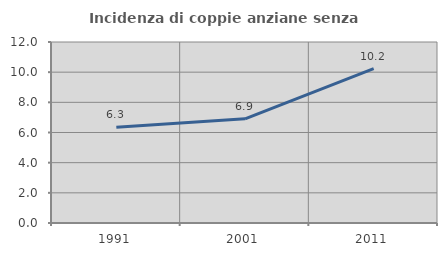
| Category | Incidenza di coppie anziane senza figli  |
|---|---|
| 1991.0 | 6.342 |
| 2001.0 | 6.909 |
| 2011.0 | 10.241 |